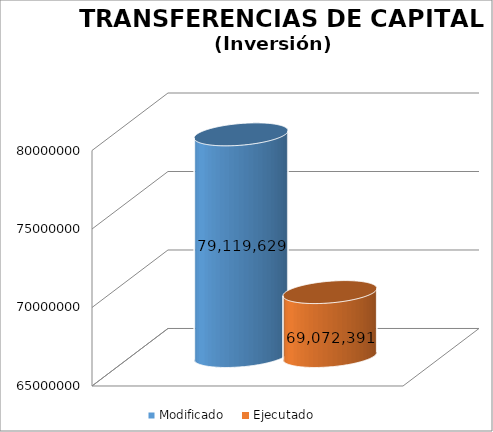
| Category | Modificado | Ejecutado |
|---|---|---|
| 0 | 79119629 | 69072390.57 |